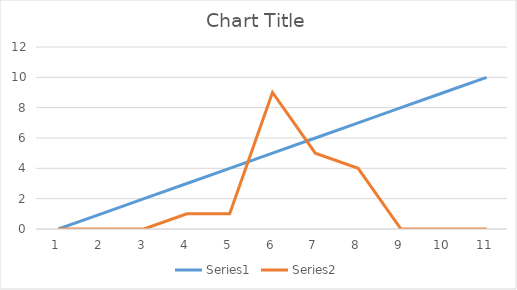
| Category | Series 0 | Series 1 |
|---|---|---|
| 0 | 0 | 0 |
| 1 | 1 | 0 |
| 2 | 2 | 0 |
| 3 | 3 | 1 |
| 4 | 4 | 1 |
| 5 | 5 | 9 |
| 6 | 6 | 5 |
| 7 | 7 | 4 |
| 8 | 8 | 0 |
| 9 | 9 | 0 |
| 10 | 10 | 0 |